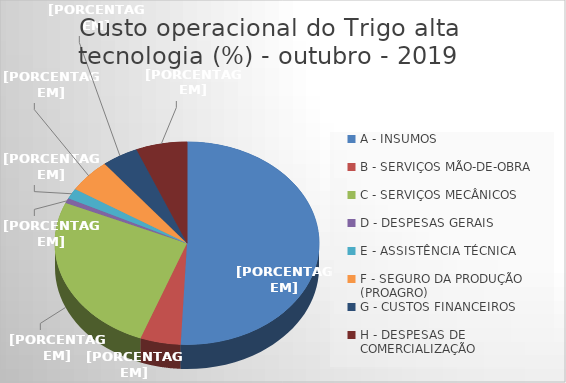
| Category | Series 0 |
|---|---|
| A - INSUMOS | 50.762 |
| B - SERVIÇOS MÃO-DE-OBRA | 4.946 |
| C - SERVIÇOS MECÂNICOS | 25.773 |
| D - DESPESAS GERAIS  | 0.815 |
| E - ASSISTÊNCIA TÉCNICA | 1.646 |
| F - SEGURO DA PRODUÇÃO (PROAGRO) | 5.349 |
| G - CUSTOS FINANCEIROS | 4.465 |
| H - DESPESAS DE COMERCIALIZAÇÃO | 6.244 |